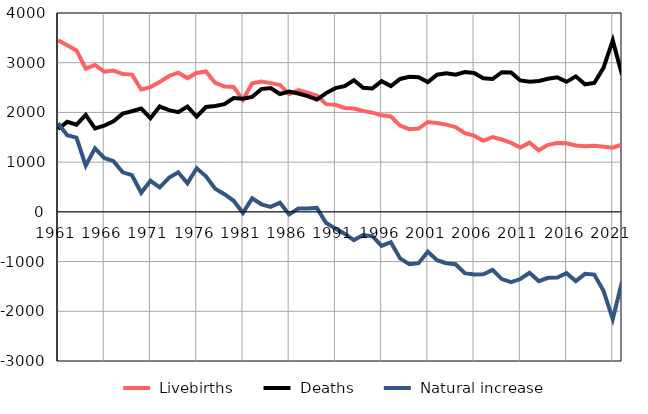
| Category |  Livebirths |  Deaths |  Natural increase |
|---|---|---|---|
| 1961.0 | 3450 | 1667 | 1783 |
| 1962.0 | 3351 | 1811 | 1540 |
| 1963.0 | 3247 | 1753 | 1494 |
| 1964.0 | 2880 | 1951 | 929 |
| 1965.0 | 2956 | 1679 | 1277 |
| 1966.0 | 2820 | 1735 | 1085 |
| 1967.0 | 2842 | 1822 | 1020 |
| 1968.0 | 2772 | 1976 | 796 |
| 1969.0 | 2761 | 2024 | 737 |
| 1970.0 | 2461 | 2077 | 384 |
| 1971.0 | 2510 | 1885 | 625 |
| 1972.0 | 2612 | 2119 | 493 |
| 1973.0 | 2733 | 2047 | 686 |
| 1974.0 | 2800 | 2005 | 795 |
| 1975.0 | 2691 | 2117 | 574 |
| 1976.0 | 2793 | 1915 | 878 |
| 1977.0 | 2825 | 2109 | 716 |
| 1978.0 | 2597 | 2131 | 466 |
| 1979.0 | 2522 | 2166 | 356 |
| 1980.0 | 2513 | 2290 | 223 |
| 1981.0 | 2253 | 2274 | -21 |
| 1982.0 | 2585 | 2313 | 272 |
| 1983.0 | 2622 | 2470 | 152 |
| 1984.0 | 2589 | 2490 | 99 |
| 1985.0 | 2554 | 2370 | 184 |
| 1986.0 | 2369 | 2421 | -52 |
| 1987.0 | 2448 | 2380 | 68 |
| 1988.0 | 2399 | 2329 | 70 |
| 1989.0 | 2339 | 2259 | 80 |
| 1990.0 | 2166 | 2389 | -223 |
| 1991.0 | 2153 | 2488 | -335 |
| 1992.0 | 2091 | 2530 | -439 |
| 1993.0 | 2080 | 2648 | -568 |
| 1994.0 | 2031 | 2497 | -466 |
| 1995.0 | 1995 | 2483 | -488 |
| 1996.0 | 1942 | 2628 | -686 |
| 1997.0 | 1919 | 2530 | -611 |
| 1998.0 | 1736 | 2673 | -937 |
| 1999.0 | 1662 | 2716 | -1054 |
| 2000.0 | 1675 | 2708 | -1033 |
| 2001.0 | 1808 | 2610 | -802 |
| 2002.0 | 1788 | 2759 | -971 |
| 2003.0 | 1755 | 2789 | -1034 |
| 2004.0 | 1704 | 2758 | -1054 |
| 2005.0 | 1582 | 2814 | -1232 |
| 2006.0 | 1533 | 2793 | -1260 |
| 2007.0 | 1429 | 2686 | -1257 |
| 2008.0 | 1505 | 2672 | -1167 |
| 2009.0 | 1455 | 2808 | -1353 |
| 2010.0 | 1388 | 2803 | -1415 |
| 2011.0 | 1293 | 2644 | -1351 |
| 2012.0 | 1391 | 2617 | -1226 |
| 2013.0 | 1240 | 2633 | -1393 |
| 2014.0 | 1349 | 2676 | -1327 |
| 2015.0 | 1383 | 2705 | -1322 |
| 2016.0 | 1381 | 2615 | -1234 |
| 2017.0 | 1334 | 2726 | -1392 |
| 2018.0 | 1319 | 2566 | -1247 |
| 2019.0 | 1330 | 2592 | -1262 |
| 2020.0 | 1309 | 2898 | -1589 |
| 2021.0 | 1292 | 3448 | -2156 |
| 2022.0 | 1353 | 2760 | -1407 |